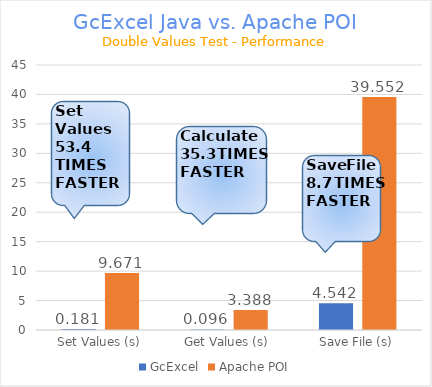
| Category | GcExcel | Apache POI |
|---|---|---|
| Set Values (s) | 0.181 | 9.671 |
| Get Values (s) | 0.096 | 3.388 |
| Save File (s) | 4.542 | 39.552 |